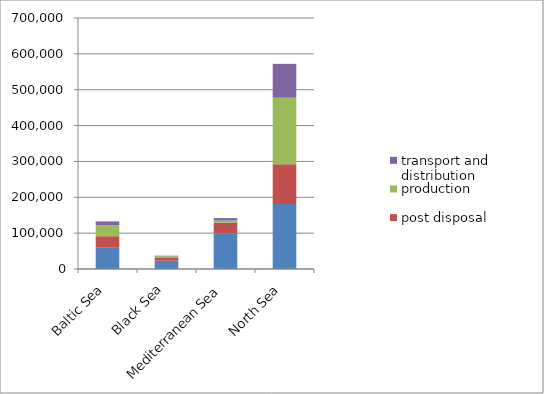
| Category | consumption | post disposal | production | transport and distribution |
|---|---|---|---|---|
| Baltic Sea | 60842.25 | 30537.75 | 31278.25 | 10065 |
| Black Sea | 23043 | 9447.25 | 3103.5 | 1493.75 |
| Mediterranean Sea | 98865 | 30023.5 | 6132 | 6910.75 |
| North Sea | 181297.25 | 111104.25 | 185314.5 | 94380 |